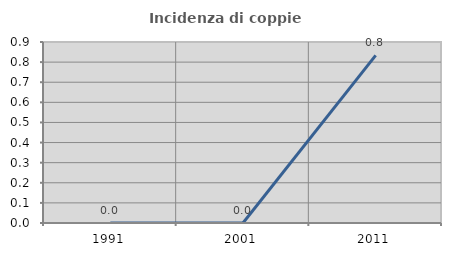
| Category | Incidenza di coppie miste |
|---|---|
| 1991.0 | 0 |
| 2001.0 | 0 |
| 2011.0 | 0.833 |